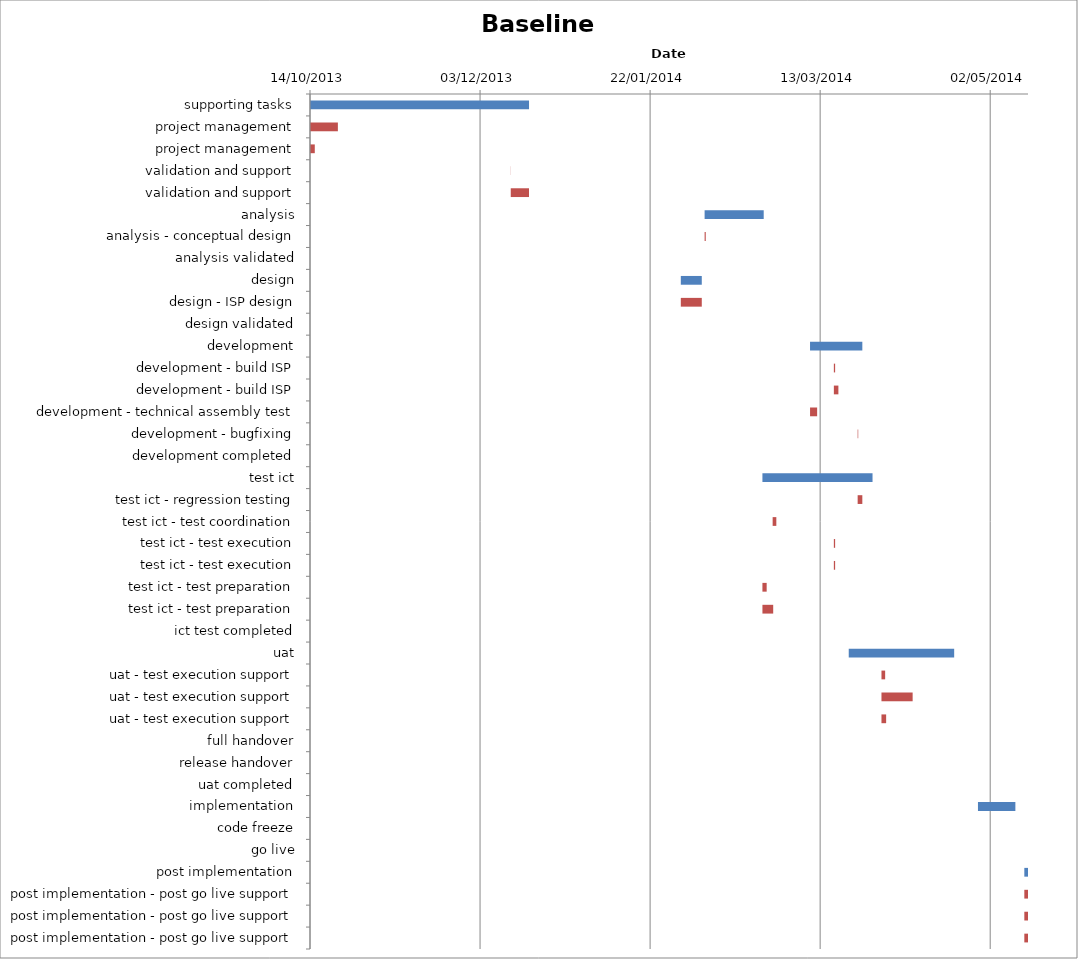
| Category | Baseline start | Actual duration |
|---|---|---|
| supporting tasks | 41561.333 | 64.375 |
| project management | 41561.333 | 8.167 |
| project management | 41561.333 | 1.375 |
| validation and support | 41620.333 | 0.042 |
| validation and support | 41620.333 | 5.375 |
| analysis | 41677.333 | 17.375 |
| analysis - conceptual design | 41677.333 | 0.333 |
| analysis validated | 41694.708 | 0 |
| design | 41670.333 | 6.167 |
| design - ISP design | 41670.333 | 6.167 |
| design validated | 41676.5 | 0 |
| development | 41708.333 | 15.375 |
| development - build ISP | 41715.333 | 0.375 |
| development - build ISP | 41715.333 | 1.333 |
| development - technical assembly test | 41708.333 | 2.083 |
| development - bugfixing | 41722.333 | 0.167 |
| development completed | 41723.708 | 0 |
| test ict | 41694.333 | 32.375 |
| test ict - regression testing | 41722.333 | 1.375 |
| test ict - test coordination | 41697.333 | 1.083 |
| test ict - test execution | 41715.333 | 0.375 |
| test ict - test execution | 41715.333 | 0.375 |
| test ict - test preparation | 41694.333 | 1.25 |
| test ict - test preparation | 41694.333 | 3.167 |
| ict test completed | 41726.708 | 0 |
| uat | 41719.708 | 31 |
| uat - test execution support | 41729.333 | 1.083 |
| uat - test execution support | 41729.333 | 9.167 |
| uat - test execution support | 41729.333 | 1.375 |
| full handover | 41722.708 | 0 |
| release handover | 41719.708 | 0 |
| uat completed | 41750.708 | 0 |
| implementation | 41757.708 | 11 |
| code freeze | 41757.708 | 0 |
| go live | 41768.708 | 0 |
| post implementation | 41771.333 | 1.083 |
| post implementation - post go live support | 41771.333 | 1.083 |
| post implementation - post go live support | 41771.333 | 1.083 |
| post implementation - post go live support | 41771.333 | 1.083 |